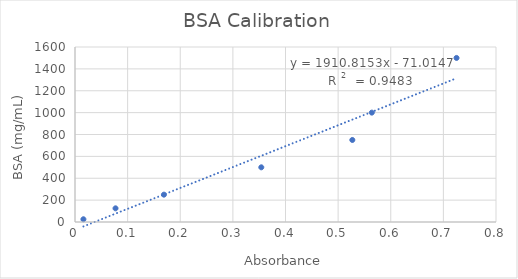
| Category | Series 0 |
|---|---|
| 0.7249999999999999 | 1500 |
| 0.5640000000000001 | 1000 |
| 0.5269999999999999 | 750 |
| 0.35400000000000004 | 500 |
| 0.16899999999999998 | 250 |
| 0.07700000000000001 | 125 |
| 0.016000000000000014 | 25 |